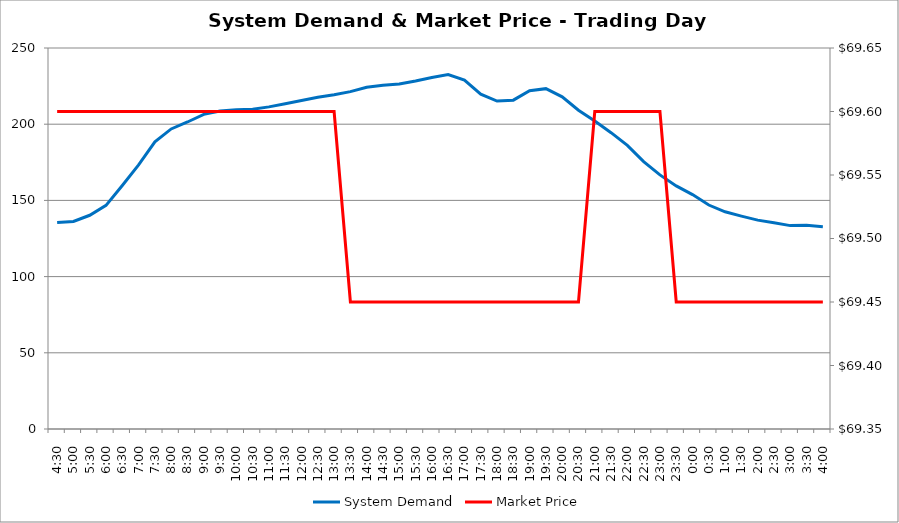
| Category | System Demand |
|---|---|
| 0.1875 | 135.53 |
| 0.20833333333333334 | 136.16 |
| 0.22916666666666666 | 140.24 |
| 0.25 | 146.72 |
| 0.270833333333333 | 159.81 |
| 0.291666666666667 | 173.31 |
| 0.3125 | 188.47 |
| 0.333333333333333 | 196.89 |
| 0.354166666666667 | 201.45 |
| 0.375 | 206.47 |
| 0.395833333333333 | 208.64 |
| 0.416666666666667 | 209.53 |
| 0.4375 | 209.83 |
| 0.458333333333333 | 211.36 |
| 0.479166666666667 | 213.47 |
| 0.5 | 215.54 |
| 0.520833333333333 | 217.63 |
| 0.541666666666667 | 219.35 |
| 0.5625 | 221.38 |
| 0.583333333333333 | 224.29 |
| 0.604166666666667 | 225.54 |
| 0.625 | 226.32 |
| 0.645833333333334 | 228.38 |
| 0.666666666666667 | 230.7 |
| 0.6875 | 232.53 |
| 0.708333333333334 | 228.88 |
| 0.729166666666667 | 219.7 |
| 0.75 | 215.16 |
| 0.770833333333334 | 215.78 |
| 0.791666666666667 | 221.95 |
| 0.8125 | 223.33 |
| 0.833333333333334 | 217.95 |
| 0.854166666666667 | 209.15 |
| 0.875 | 202.14 |
| 0.895833333333334 | 194.43 |
| 0.916666666666667 | 186.08 |
| 0.9375 | 175.45 |
| 0.958333333333334 | 166.72 |
| 0.979166666666667 | 159.53 |
| 1900-01-01 | 153.8 |
| 1900-01-01 00:30:00 | 146.97 |
| 1900-01-01 01:00:00 | 142.51 |
| 1900-01-01 01:30:00 | 139.68 |
| 1900-01-01 02:00:00 | 137.06 |
| 1900-01-01 02:30:00 | 135.37 |
| 1900-01-01 03:00:00 | 133.46 |
| 1900-01-01 03:30:00 | 133.7 |
| 1900-01-01 04:00:00 | 132.73 |